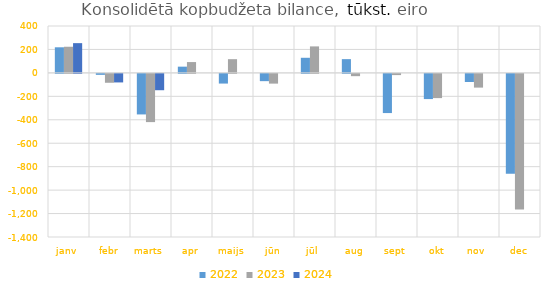
| Category | 2022 | 2023 | 2024 |
|---|---|---|---|
| janv | 218389.091 | 223039.368 | 253732.151 |
| febr | -8203.95 | -75727.525 | -72861.155 |
| marts | -345869.737 | -411380.469 | -139295.222 |
| apr | 53138.837 | 92355.55 | 0 |
| maijs | -82553.768 | 116986.885 | 0 |
| jūn | -61976.694 | -83017.071 | 0 |
| jūl | 128860.015 | 225991.399 | 0 |
| aug | 117341.161 | -19435.504 | 0 |
| sept | -334219.509 | -10334.49 | 0 |
| okt | -214870.466 | -206638.491 | 0 |
| nov | -69420.277 | -117014.401 | 0 |
| dec | -851302.945 | -1157739.041 | 0 |